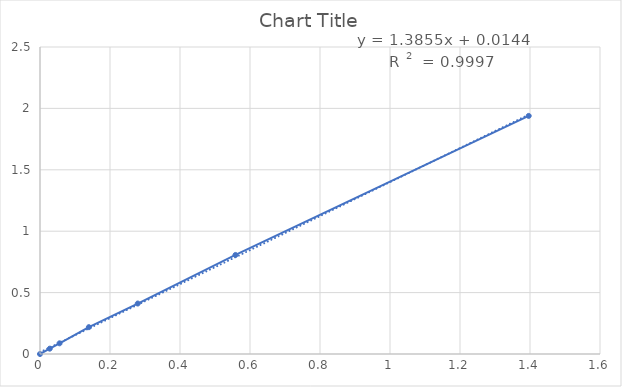
| Category | Series 0 |
|---|---|
| 0.0 | 0 |
| 0.027925 | 0.043 |
| 0.05585 | 0.087 |
| 0.139625 | 0.218 |
| 0.27925 | 0.411 |
| 0.5585 | 0.806 |
| 1.39625 | 1.939 |